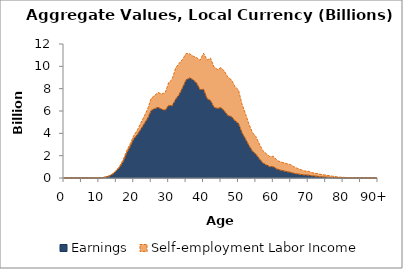
| Category | Earnings | Self-employment Labor Income |
|---|---|---|
| 0 | 0 | 0 |
|  | 0 | 0 |
| 2 | 0 | 0 |
| 3 | 0 | 0 |
| 4 | 0 | 0 |
| 5 | 0 | 0 |
| 6 | 0.194 | 0 |
| 7 | 0.602 | 0 |
| 8 | 2.309 | 0.332 |
| 9 | 8.009 | 1.841 |
| 10 | 16.105 | 3.736 |
| 11 | 31.242 | 8.621 |
| 12 | 75.285 | 14.422 |
| 13 | 175.543 | 20.453 |
| 14 | 357.347 | 32.933 |
| 15 | 633.516 | 46.574 |
| 16 | 977.894 | 112.408 |
| 17 | 1491.174 | 167.714 |
| 18 | 2249.156 | 222.064 |
| 19 | 2850.248 | 227.367 |
| 20 | 3509.865 | 296.341 |
| 21 | 3876.806 | 394.834 |
| 22 | 4360.734 | 545.962 |
| 23 | 4856.239 | 664.391 |
| 24 | 5358.552 | 830.088 |
| 25 | 6052.741 | 1081.165 |
| 26 | 6212.388 | 1191.092 |
| 27 | 6321.11 | 1329.456 |
| 28 | 6159.387 | 1369.34 |
| 29 | 6062.239 | 1565.764 |
| 30 | 6501.131 | 2035.681 |
| 31 | 6458.434 | 2379.696 |
| 32 | 7051.159 | 2799.353 |
| 33 | 7459.75 | 2812.123 |
| 34 | 8092.404 | 2540.29 |
| 35 | 8787.622 | 2362.001 |
| 36 | 8955.073 | 2175.221 |
| 37 | 8808.036 | 2102.282 |
| 38 | 8488.289 | 2299.801 |
| 39 | 7912.668 | 2625.323 |
| 40 | 7942.606 | 3228.116 |
| 41 | 7111.178 | 3446.987 |
| 42 | 6939.476 | 3793.665 |
| 43 | 6329.23 | 3612.28 |
| 44 | 6228.296 | 3486.608 |
| 45 | 6304.299 | 3578.764 |
| 46 | 5987.942 | 3561.2 |
| 47 | 5582.366 | 3436.587 |
| 48 | 5492.519 | 3293.519 |
| 49 | 5121.379 | 3070.586 |
| 50 | 4893.696 | 2992.108 |
| 51 | 4072.256 | 2561.537 |
| 52 | 3505.677 | 2269.666 |
| 53 | 2920.925 | 1914.448 |
| 54 | 2411.52 | 1667.69 |
| 55 | 2134.082 | 1572.577 |
| 56 | 1715.969 | 1332.848 |
| 57 | 1341.089 | 1107.03 |
| 58 | 1172.369 | 1004.709 |
| 59 | 1011.738 | 897.403 |
| 60 | 1006.274 | 942.636 |
| 61 | 798.906 | 792.835 |
| 62 | 704.449 | 743.58 |
| 63 | 632.168 | 730.718 |
| 64 | 557.455 | 710.217 |
| 65 | 501.229 | 689.33 |
| 66 | 406.034 | 583.361 |
| 67 | 355.176 | 494.01 |
| 68 | 312.596 | 424.135 |
| 69 | 264.568 | 356.569 |
| 70 | 256.399 | 351.047 |
| 71 | 196.797 | 282.892 |
| 72 | 165.315 | 262.953 |
| 73 | 134.273 | 234.265 |
| 74 | 99.271 | 203.168 |
| 75 | 79.806 | 185.938 |
| 76 | 56.354 | 153.587 |
| 77 | 37.049 | 118.919 |
| 78 | 25.742 | 93.312 |
| 79 | 17.353 | 61.116 |
| 80 | 17.211 | 45.471 |
| 81 | 12.313 | 25.081 |
| 82 | 9.975 | 17.081 |
| 83 | 7.917 | 10.715 |
| 84 | 7.021 | 6.292 |
| 85 | 5.959 | 4.637 |
| 86 | 4.459 | 2.227 |
| 87 | 3.27 | 0.29 |
| 88 | 2.398 | 0 |
| 89 | 1.692 | 0 |
| 90+ | 19.062 | 0 |